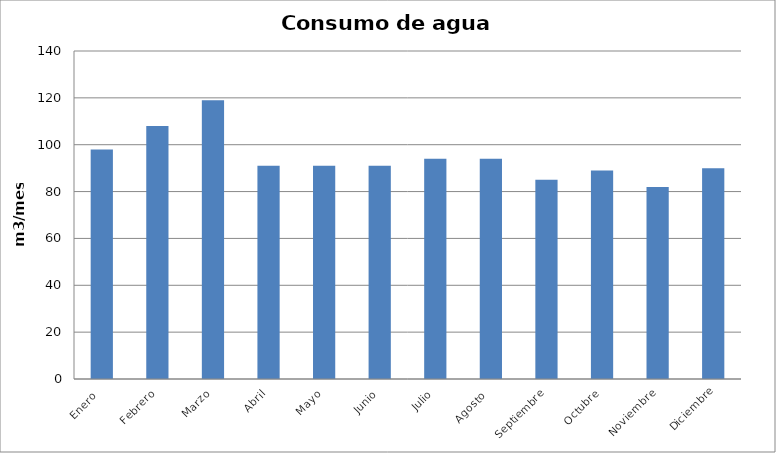
| Category | Series 0 |
|---|---|
| Enero  | 98 |
| Febrero | 108 |
| Marzo | 119 |
| Abril | 91 |
| Mayo | 91 |
| Junio | 91 |
| Julio | 94 |
| Agosto  | 94 |
| Septiembre | 85 |
| Octubre | 89 |
| Noviembre | 82 |
| Diciembre | 90 |